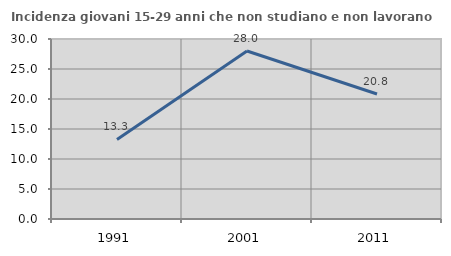
| Category | Incidenza giovani 15-29 anni che non studiano e non lavorano  |
|---|---|
| 1991.0 | 13.253 |
| 2001.0 | 28 |
| 2011.0 | 20.833 |